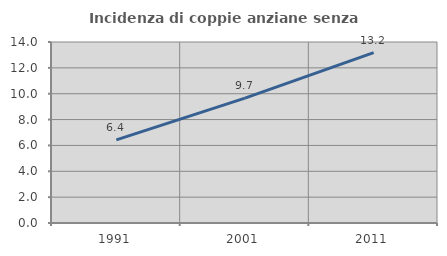
| Category | Incidenza di coppie anziane senza figli  |
|---|---|
| 1991.0 | 6.425 |
| 2001.0 | 9.653 |
| 2011.0 | 13.178 |